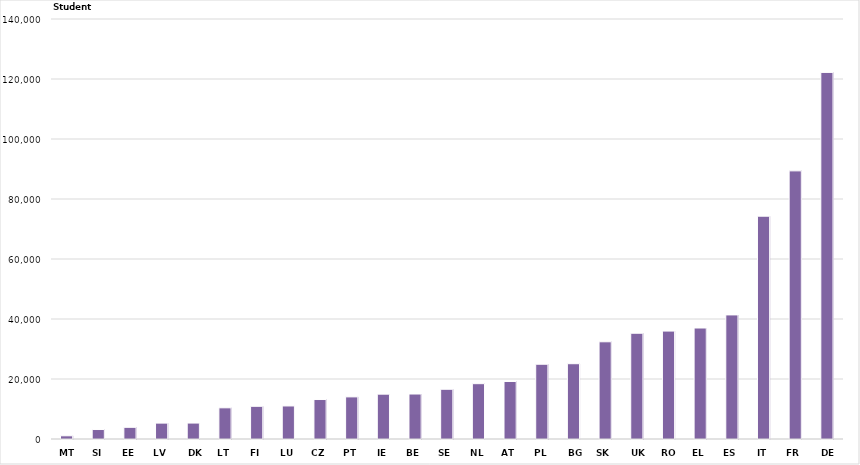
| Category | Series 0 |
|---|---|
| MT | 1064 |
| SI | 3157 |
| EE | 3891 |
| LV | 5297 |
| DK | 5313 |
| LT | 10395 |
| FI | 10899 |
| LU | 11015 |
| CZ | 13159 |
| PT | 14039 |
| IE | 14943 |
| BE | 14992 |
| SE | 16577 |
| NL | 18438 |
| AT | 19170 |
| PL | 24918 |
| BG | 25094 |
| SK | 32404 |
| UK | 35252 |
| RO | 35973 |
| EL | 36995 |
| ES | 41361 |
| IT | 74268 |
| FR | 89379 |
| DE | 122195 |